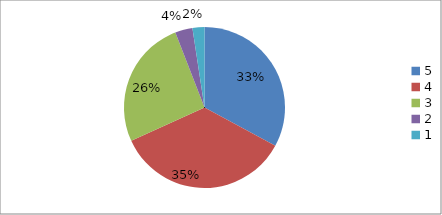
| Category | Series 0 | Series 1 |
|---|---|---|
| 5.0 | 32.9 | 32.9 |
| 4.0 | 35.3 | 35.3 |
| 3.0 | 25.9 | 25.9 |
| 2.0 | 3.5 | 3.5 |
| 1.0 | 2.4 | 2.4 |